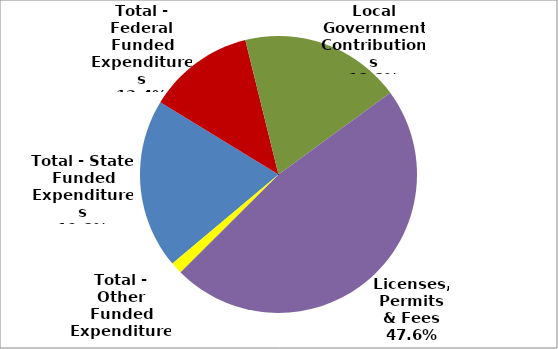
| Category | Series 0 |
|---|---|
| Total - State Funded Expenditures | 2153785 |
| Total - Federal Funded Expenditures | 1348047 |
| Local Government Contributions | 2041232 |
| Licenses, Permits & Fees | 5164291 |
| Total - Other Funded Expenditures | 148095 |